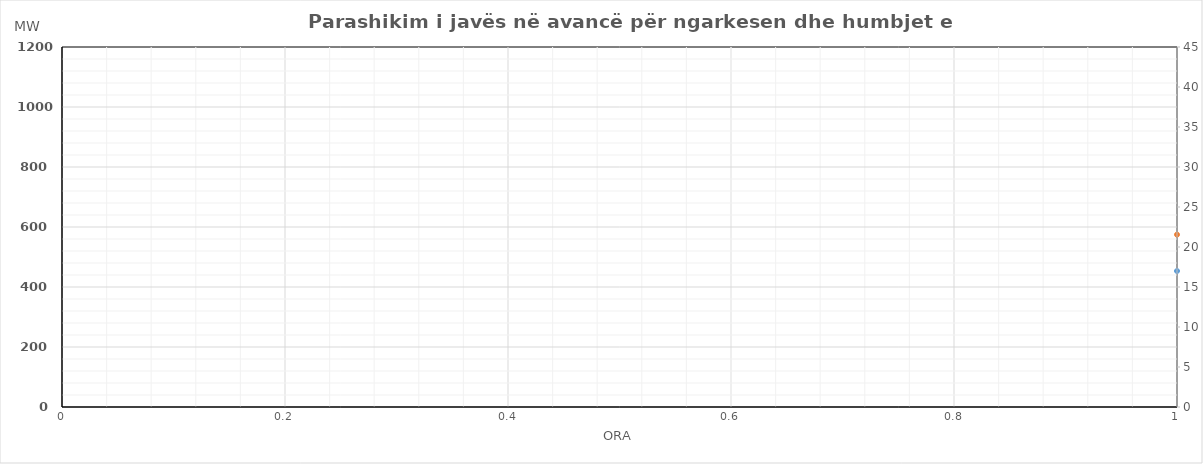
| Category | Ngarkesa (MWh) |
|---|---|
| 0 | 574.6 |
| 1 | 517.54 |
| 2 | 495.24 |
| 3 | 489.04 |
| 4 | 493.24 |
| 5 | 534.11 |
| 6 | 648.24 |
| 7 | 811.25 |
| 8 | 862.13 |
| 9 | 852.14 |
| 10 | 784.45 |
| 11 | 765.18 |
| 12 | 760.23 |
| 13 | 771.42 |
| 14 | 791.93 |
| 15 | 785.53 |
| 16 | 775.84 |
| 17 | 807.55 |
| 18 | 844.35 |
| 19 | 925.76 |
| 20 | 964.22 |
| 21 | 900.83 |
| 22 | 796.99 |
| 23 | 672.12 |
| 24 | 566.88 |
| 25 | 514.7 |
| 26 | 507.59 |
| 27 | 507.69 |
| 28 | 507.09 |
| 29 | 532.44 |
| 30 | 645.85 |
| 31 | 806.32 |
| 32 | 856.52 |
| 33 | 865.91 |
| 34 | 775.29 |
| 35 | 756.99 |
| 36 | 750.77 |
| 37 | 773.14 |
| 38 | 810.34 |
| 39 | 804.63 |
| 40 | 802.66 |
| 41 | 835.89 |
| 42 | 862.49 |
| 43 | 914.43 |
| 44 | 961.65 |
| 45 | 902.53 |
| 46 | 802.23 |
| 47 | 676.89 |
| 48 | 572.98 |
| 49 | 518.98 |
| 50 | 497.68 |
| 51 | 493.48 |
| 52 | 495.17 |
| 53 | 537.29 |
| 54 | 644.5 |
| 55 | 803.15 |
| 56 | 862.51 |
| 57 | 860.69 |
| 58 | 796.25 |
| 59 | 777.29 |
| 60 | 763.95 |
| 61 | 766.74 |
| 62 | 797.93 |
| 63 | 796.91 |
| 64 | 791.33 |
| 65 | 815.02 |
| 66 | 847.09 |
| 67 | 902.93 |
| 68 | 955.1 |
| 69 | 899.13 |
| 70 | 796.9 |
| 71 | 671.4 |
| 72 | 565.4 |
| 73 | 515.31 |
| 74 | 509.41 |
| 75 | 508.41 |
| 76 | 507.93 |
| 77 | 533.06 |
| 78 | 644.5 |
| 79 | 793.8 |
| 80 | 840.81 |
| 81 | 825.4 |
| 82 | 835.32 |
| 83 | 826.53 |
| 84 | 840.8 |
| 85 | 841.99 |
| 86 | 882.19 |
| 87 | 883.44 |
| 88 | 874.42 |
| 89 | 883.54 |
| 90 | 927.05 |
| 91 | 973.38 |
| 92 | 1025.5 |
| 93 | 974.61 |
| 94 | 858.81 |
| 95 | 732.01 |
| 96 | 602.21 |
| 97 | 546.75 |
| 98 | 525.41 |
| 99 | 520.09 |
| 100 | 528.42 |
| 101 | 573.08 |
| 102 | 686.36 |
| 103 | 852.9 |
| 104 | 908.38 |
| 105 | 904.28 |
| 106 | 839.24 |
| 107 | 827.21 |
| 108 | 765.13 |
| 109 | 766.12 |
| 110 | 792.36 |
| 111 | 798.42 |
| 112 | 814.5 |
| 113 | 845.02 |
| 114 | 879.41 |
| 115 | 950.37 |
| 116 | 1000.41 |
| 117 | 919.64 |
| 118 | 814.19 |
| 119 | 681.57 |
| 120 | 589.1 |
| 121 | 535.57 |
| 122 | 516.22 |
| 123 | 505.05 |
| 124 | 514.37 |
| 125 | 556.03 |
| 126 | 654.46 |
| 127 | 782.07 |
| 128 | 870.24 |
| 129 | 879.15 |
| 130 | 850.43 |
| 131 | 835.91 |
| 132 | 834.5 |
| 133 | 871.32 |
| 134 | 855.09 |
| 135 | 837.86 |
| 136 | 842.71 |
| 137 | 869.14 |
| 138 | 860.65 |
| 139 | 911.45 |
| 140 | 982 |
| 141 | 913.92 |
| 142 | 790.32 |
| 143 | 697.43 |
| 144 | 653.6 |
| 145 | 597.17 |
| 146 | 555.92 |
| 147 | 528.45 |
| 148 | 524.07 |
| 149 | 548.23 |
| 150 | 615.26 |
| 151 | 706.77 |
| 152 | 783.44 |
| 153 | 817.55 |
| 154 | 836.83 |
| 155 | 891.51 |
| 156 | 884.6 |
| 157 | 865.62 |
| 158 | 833.09 |
| 159 | 818.76 |
| 160 | 762.01 |
| 161 | 795.54 |
| 162 | 812.65 |
| 163 | 885.55 |
| 164 | 965.2 |
| 165 | 916.02 |
| 166 | 810.92 |
| 167 | 687.63 |